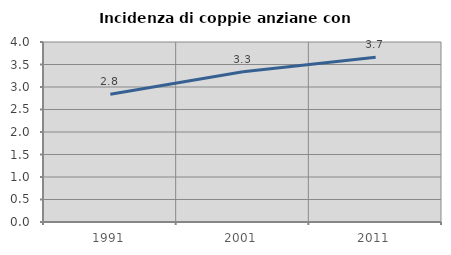
| Category | Incidenza di coppie anziane con figli |
|---|---|
| 1991.0 | 2.838 |
| 2001.0 | 3.34 |
| 2011.0 | 3.659 |